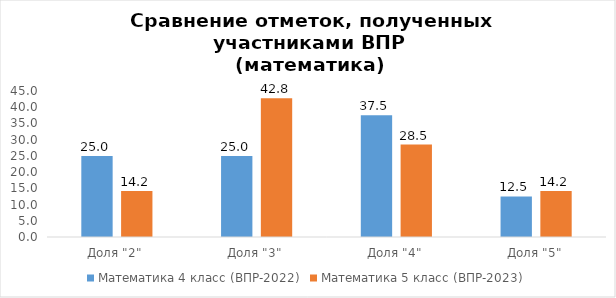
| Category | Математика 4 класс (ВПР-2022) | Математика 5 класс (ВПР-2023) |
|---|---|---|
| Доля "2" | 25 | 14.2 |
| Доля "3" | 25 | 42.8 |
| Доля "4" | 37.5 | 28.5 |
| Доля "5" | 12.5 | 14.2 |